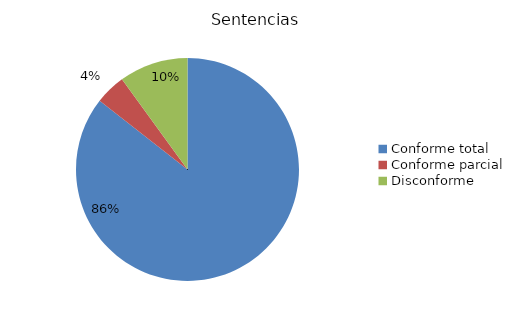
| Category | Sentencias |
|---|---|
| Conforme total | 77 |
| Conforme parcial | 4 |
| Disconforme | 9 |